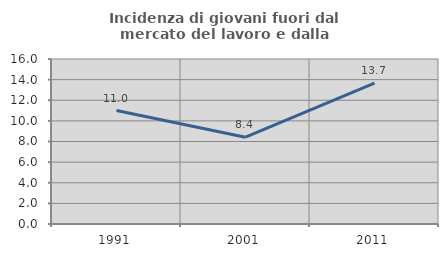
| Category | Incidenza di giovani fuori dal mercato del lavoro e dalla formazione  |
|---|---|
| 1991.0 | 11.001 |
| 2001.0 | 8.414 |
| 2011.0 | 13.65 |